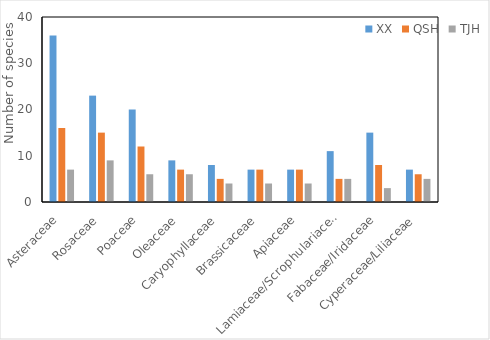
| Category | XX | QSH | TJH |
|---|---|---|---|
| Asteraceae | 36 | 16 | 7 |
| Rosaceae | 23 | 15 | 9 |
| Poaceae | 20 | 12 | 6 |
| Oleaceae | 9 | 7 | 6 |
| Caryophyllaceae | 8 | 5 | 4 |
| Brassicaceae | 7 | 7 | 4 |
| Apiaceae | 7 | 7 | 4 |
| Lamiaceae/Scrophulariaceae | 11 | 5 | 5 |
| Fabaceae/Iridaceae | 15 | 8 | 3 |
| Cyperaceae/Liliaceae | 7 | 6 | 5 |